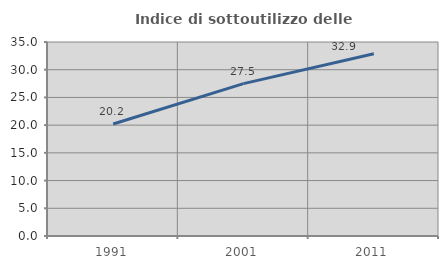
| Category | Indice di sottoutilizzo delle abitazioni  |
|---|---|
| 1991.0 | 20.212 |
| 2001.0 | 27.495 |
| 2011.0 | 32.878 |